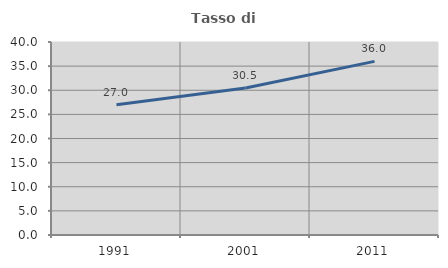
| Category | Tasso di occupazione   |
|---|---|
| 1991.0 | 26.979 |
| 2001.0 | 30.473 |
| 2011.0 | 35.987 |